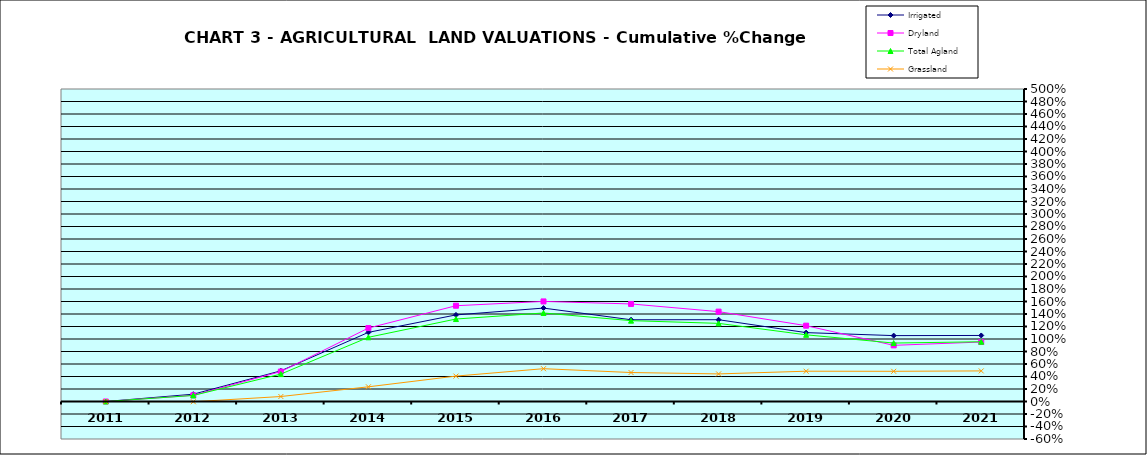
| Category | Irrigated | Dryland | Total Agland | Grassland |
|---|---|---|---|---|
| 2011.0 | 0 | 0 | 0 | 0 |
| 2012.0 | 0.117 | 0.099 | 0.097 | -0.004 |
| 2013.0 | 0.491 | 0.479 | 0.439 | 0.08 |
| 2014.0 | 1.106 | 1.175 | 1.027 | 0.235 |
| 2015.0 | 1.385 | 1.532 | 1.32 | 0.406 |
| 2016.0 | 1.495 | 1.601 | 1.416 | 0.525 |
| 2017.0 | 1.308 | 1.561 | 1.294 | 0.464 |
| 2018.0 | 1.309 | 1.438 | 1.25 | 0.441 |
| 2019.0 | 1.102 | 1.213 | 1.067 | 0.485 |
| 2020.0 | 1.054 | 0.899 | 0.935 | 0.483 |
| 2021.0 | 1.057 | 0.952 | 0.956 | 0.489 |